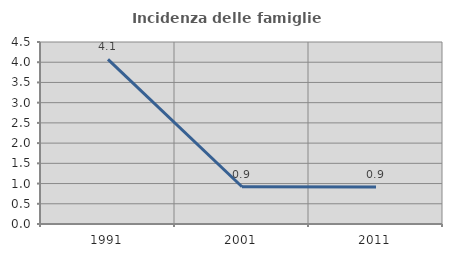
| Category | Incidenza delle famiglie numerose |
|---|---|
| 1991.0 | 4.07 |
| 2001.0 | 0.921 |
| 2011.0 | 0.917 |